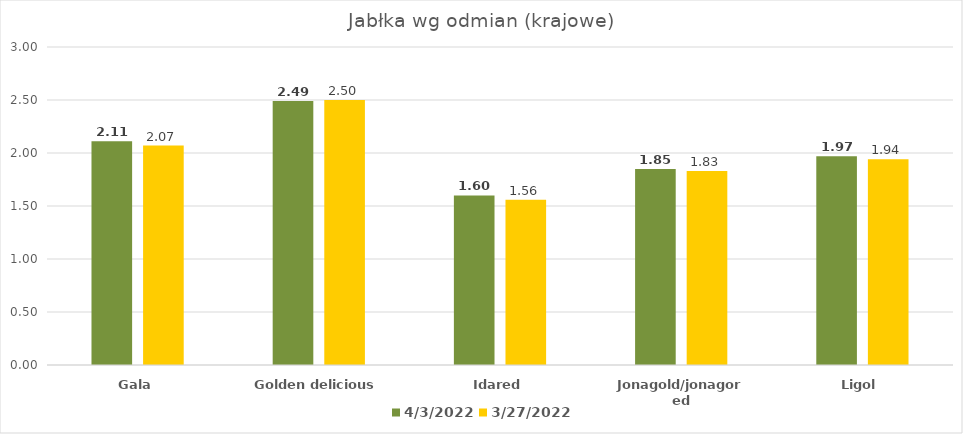
| Category | 2022-04-03 | 2022-03-27 |
|---|---|---|
| Gala | 2.11 | 2.07 |
| Golden delicious | 2.49 | 2.5 |
| Idared | 1.6 | 1.56 |
| Jonagold/jonagored | 1.85 | 1.83 |
| Ligol | 1.97 | 1.94 |